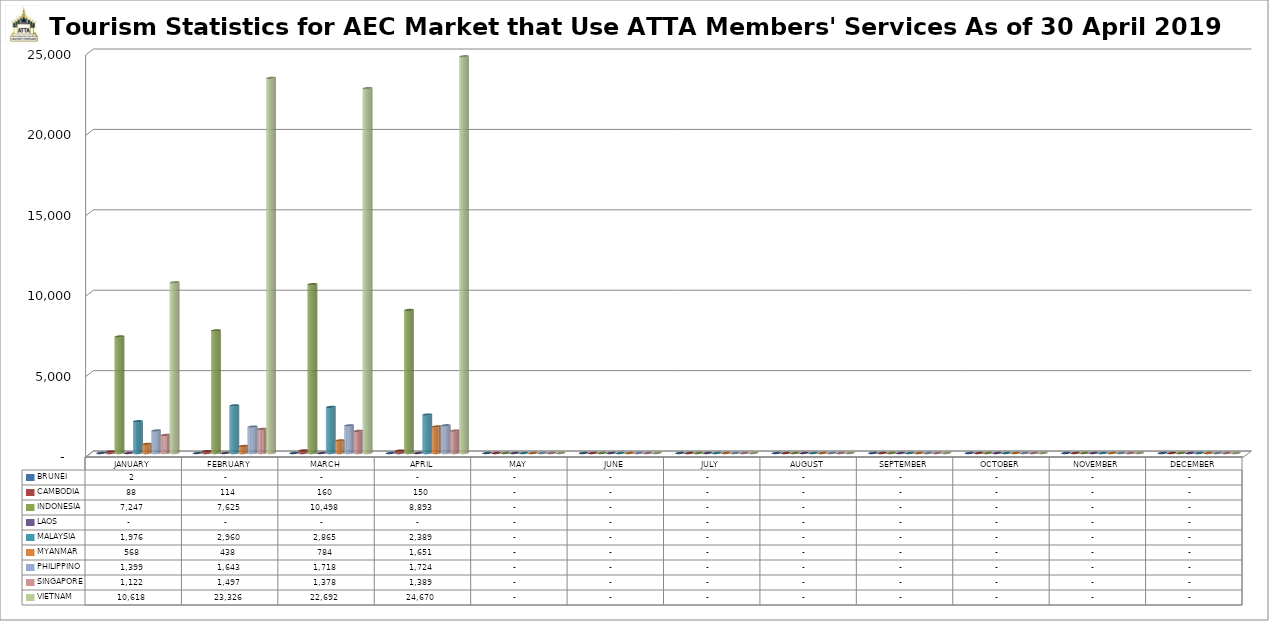
| Category | BRUNEI | CAMBODIA | INDONESIA | LAOS | MALAYSIA | MYANMAR | PHILIPPINO | SINGAPORE | VIETNAM |
|---|---|---|---|---|---|---|---|---|---|
| JANUARY | 2 | 88 | 7247 | 0 | 1976 | 568 | 1399 | 1122 | 10618 |
| FEBRUARY | 0 | 114 | 7625 | 0 | 2960 | 438 | 1643 | 1497 | 23326 |
| MARCH | 0 | 160 | 10498 | 0 | 2865 | 784 | 1718 | 1378 | 22692 |
| APRIL | 0 | 150 | 8893 | 0 | 2389 | 1651 | 1724 | 1389 | 24670 |
| MAY | 0 | 0 | 0 | 0 | 0 | 0 | 0 | 0 | 0 |
| JUNE | 0 | 0 | 0 | 0 | 0 | 0 | 0 | 0 | 0 |
| JULY | 0 | 0 | 0 | 0 | 0 | 0 | 0 | 0 | 0 |
| AUGUST | 0 | 0 | 0 | 0 | 0 | 0 | 0 | 0 | 0 |
| SEPTEMBER | 0 | 0 | 0 | 0 | 0 | 0 | 0 | 0 | 0 |
| OCTOBER | 0 | 0 | 0 | 0 | 0 | 0 | 0 | 0 | 0 |
| NOVEMBER | 0 | 0 | 0 | 0 | 0 | 0 | 0 | 0 | 0 |
| DECEMBER | 0 | 0 | 0 | 0 | 0 | 0 | 0 | 0 | 0 |